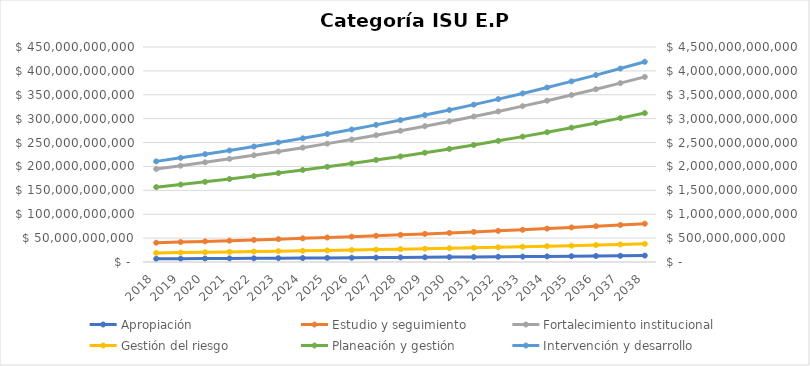
| Category | Apropiación | Estudio y seguimiento | Fortalecimiento institucional | Gestión del riesgo | Planeación y gestión |
|---|---|---|---|---|---|
| 2018.0 | 6758679503.895 | 40296693390.255 | 194708465546.451 | 19071380123.522 | 156656007081.274 |
| 2019.0 | 6995233286.531 | 41707077658.914 | 201523261840.577 | 19738878427.845 | 162138967329.118 |
| 2020.0 | 7240066451.56 | 43166825376.976 | 208576576004.997 | 20429739172.82 | 167813831185.638 |
| 2021.0 | 7493468777.364 | 44677664265.17 | 215876756165.172 | 21144780043.869 | 173687315277.135 |
| 2022.0 | 7755740184.572 | 46241382514.451 | 223432442630.953 | 21884847345.404 | 179766371311.835 |
| 2023.0 | 8027191091.032 | 47859830902.457 | 231252578123.036 | 22650817002.493 | 186058194307.749 |
| 2024.0 | 8308142779.218 | 49534924984.043 | 239346418357.343 | 23443595597.581 | 192570231108.52 |
| 2025.0 | 8598927776.491 | 51268647358.484 | 247723542999.85 | 24264121443.496 | 199310189197.318 |
| 2026.0 | 8899890248.668 | 53063050016.031 | 256393867004.844 | 25113365694.018 | 206286045819.224 |
| 2027.0 | 9211386407.371 | 54920256766.592 | 265367652350.014 | 25992333493.309 | 213506057422.897 |
| 2028.0 | 9533784931.629 | 56842465753.423 | 274655520182.264 | 26902065165.575 | 220978769432.699 |
| 2029.0 | 9867467404.236 | 58831952054.793 | 284268463388.644 | 27843637446.37 | 228713026362.843 |
| 2030.0 | 10212828763.384 | 60891070376.71 | 294217859607.246 | 28818164756.993 | 236717982285.542 |
| 2031.0 | 10570277770.103 | 63022257839.895 | 304515484693.5 | 29826800523.487 | 245003111665.536 |
| 2032.0 | 10940237492.057 | 65228036864.292 | 315173526657.772 | 30870738541.809 | 253578220573.83 |
| 2033.0 | 11323145804.279 | 67511018154.542 | 326204600090.794 | 31951214390.773 | 262453458293.914 |
| 2034.0 | 11719455907.428 | 69873903789.951 | 337621761093.972 | 33069506894.45 | 271639329334.201 |
| 2035.0 | 12129636864.188 | 72319490422.599 | 349438522732.261 | 34226939635.756 | 281146705860.898 |
| 2036.0 | 12554174154.435 | 74850672587.39 | 361668871027.89 | 35424882523.007 | 290986840566.03 |
| 2037.0 | 12993570249.84 | 77470446127.949 | 374327281513.866 | 36664753411.312 | 301171379985.841 |
| 2038.0 | 13448345208.584 | 80181911742.427 | 387428736366.852 | 37948019780.708 | 311712378285.345 |